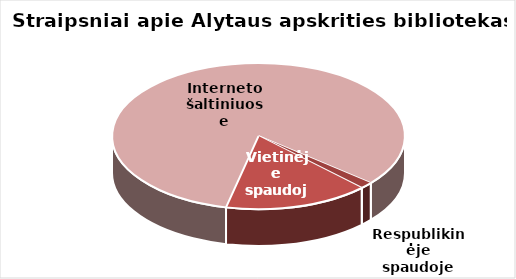
| Category | Series 0 |
|---|---|
| Respublikinėje spaudoje | 36 |
| Vietinėje spaudoje | 397 |
| Interneto šaltiniuose | 2049 |